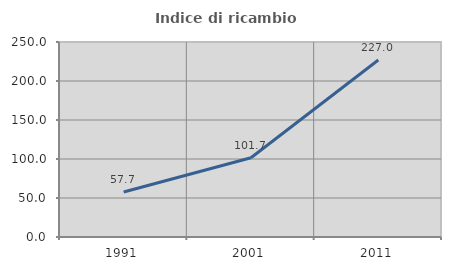
| Category | Indice di ricambio occupazionale  |
|---|---|
| 1991.0 | 57.717 |
| 2001.0 | 101.656 |
| 2011.0 | 226.996 |